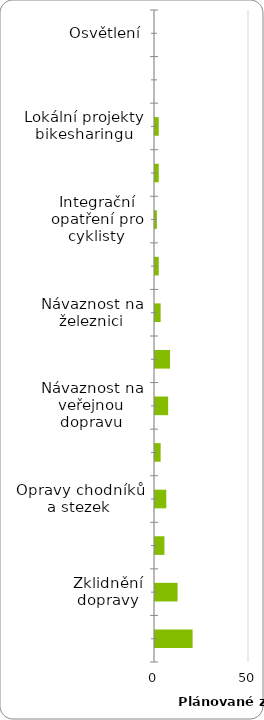
| Category | Series 0 |
|---|---|
| Osvětlení | 0 |
| Světelná signalizace (prodloužení cyklů pro BMD) | 0 |
| Lokální projekty bikesharingu | 2 |
| Parkování kol (stojany, B+R) | 2 |
| Integrační opatření pro cyklisty | 1 |
| Osvěta, komunikační akce | 2 |
| Návaznost na železnici | 3 |
| Chodníky | 8 |
| Návaznost na veřejnou dopravu | 7 |
| Studie opatření pro cyklisty a pěší, rozvojové studie, generely dopravy, koncepční dokumenty | 3 |
| Opravy chodníků a stezek | 6 |
| Žádné projekty a zlepšení | 5 |
| Zklidnění dopravy | 12 |
| Budování infrastruktury pro pěší a cyklisty | 20 |